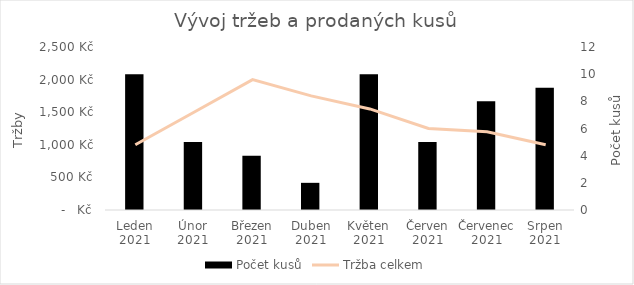
| Category | Počet kusů |
|---|---|
| Leden 2021 | 10 |
| Únor 2021 | 5 |
| Březen 2021 | 4 |
| Duben 2021 | 2 |
| Květen 2021 | 10 |
| Červen 2021 | 5 |
| Červenec 2021 | 8 |
| Srpen 2021 | 9 |